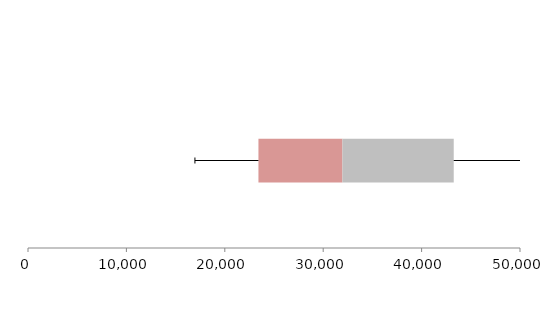
| Category | Series 1 | Series 2 | Series 3 |
|---|---|---|---|
| 0 | 23419.594 | 8534.433 | 11312.106 |